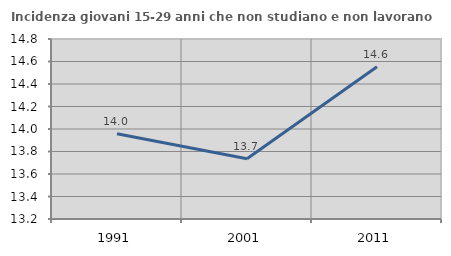
| Category | Incidenza giovani 15-29 anni che non studiano e non lavorano  |
|---|---|
| 1991.0 | 13.958 |
| 2001.0 | 13.736 |
| 2011.0 | 14.554 |